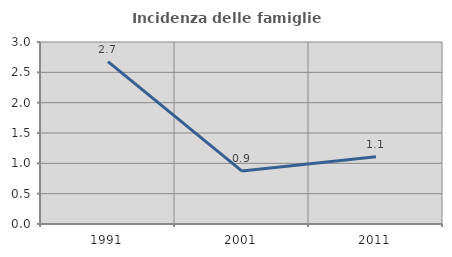
| Category | Incidenza delle famiglie numerose |
|---|---|
| 1991.0 | 2.678 |
| 2001.0 | 0.873 |
| 2011.0 | 1.108 |